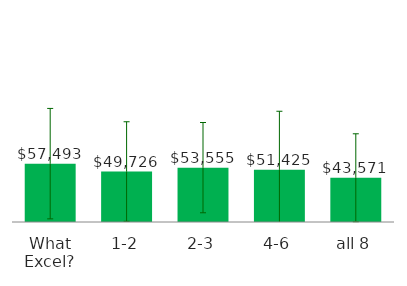
| Category | Total |
|---|---|
| What Excel? | 57493.382 |
| 1-2 | 49726.376 |
| 2-3 | 53554.662 |
| 4-6 | 51425.09 |
| all 8 | 43571.163 |